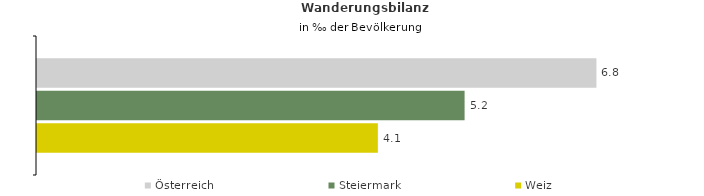
| Category | Österreich | Steiermark | Weiz |
|---|---|---|---|
| Wanderungsrate in ‰ der Bevölkerung, Periode 2015-2019 | 6.771 | 5.175 | 4.125 |